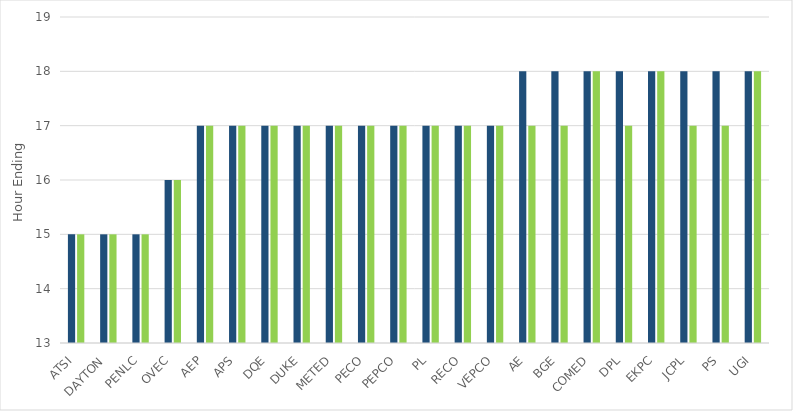
| Category | median hour (unrestricted) | median hour (unrestricted+solar estimates) |
|---|---|---|
| ATSI | 15 | 15 |
| DAYTON | 15 | 15 |
| PENLC | 15 | 15 |
| OVEC | 16 | 16 |
| AEP | 17 | 17 |
| APS | 17 | 17 |
| DQE | 17 | 17 |
| DUKE | 17 | 17 |
| METED | 17 | 17 |
| PECO | 17 | 17 |
| PEPCO | 17 | 17 |
| PL | 17 | 17 |
| RECO | 17 | 17 |
| VEPCO | 17 | 17 |
| AE | 18 | 17 |
| BGE | 18 | 17 |
| COMED | 18 | 18 |
| DPL | 18 | 17 |
| EKPC | 18 | 18 |
| JCPL | 18 | 17 |
| PS | 18 | 17 |
| UGI | 18 | 18 |